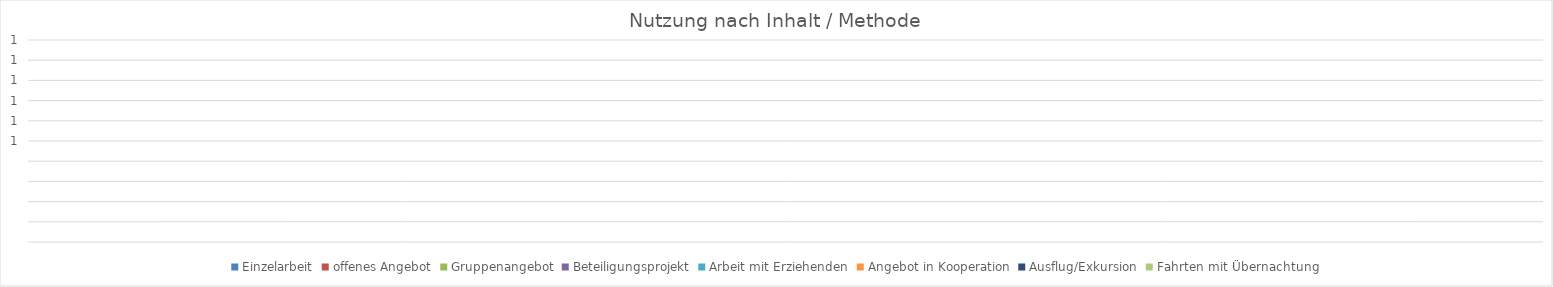
| Category | Einzelarbeit | offenes Angebot | Gruppenangebot | Beteiligungsprojekt | Arbeit mit Erziehenden | Angebot in Kooperation | Ausflug/Exkursion | Fahrten mit Übernachtung |
|---|---|---|---|---|---|---|---|---|
| 0 | 0 | 0 | 0 | 0 | 0 | 0 | 0 | 0 |